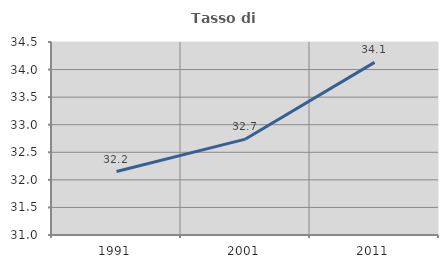
| Category | Tasso di occupazione   |
|---|---|
| 1991.0 | 32.151 |
| 2001.0 | 32.739 |
| 2011.0 | 34.13 |